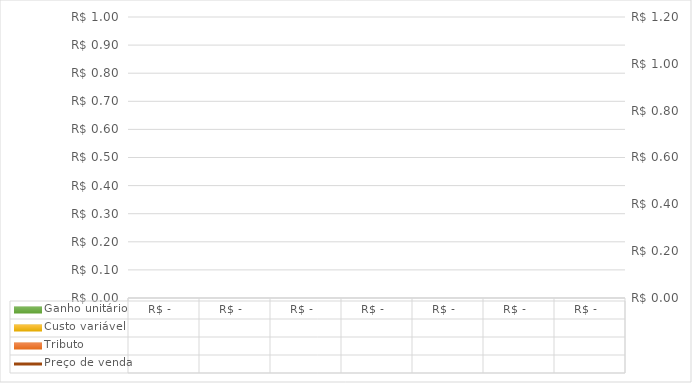
| Category | Tributo | Custo variável | Ganho unitário |
|---|---|---|---|
|  |  |  | 0 |
|  |  |  | 0 |
|  |  |  | 0 |
|  |  |  | 0 |
|  |  |  | 0 |
|  |  |  | 0 |
|  |  |  | 0 |